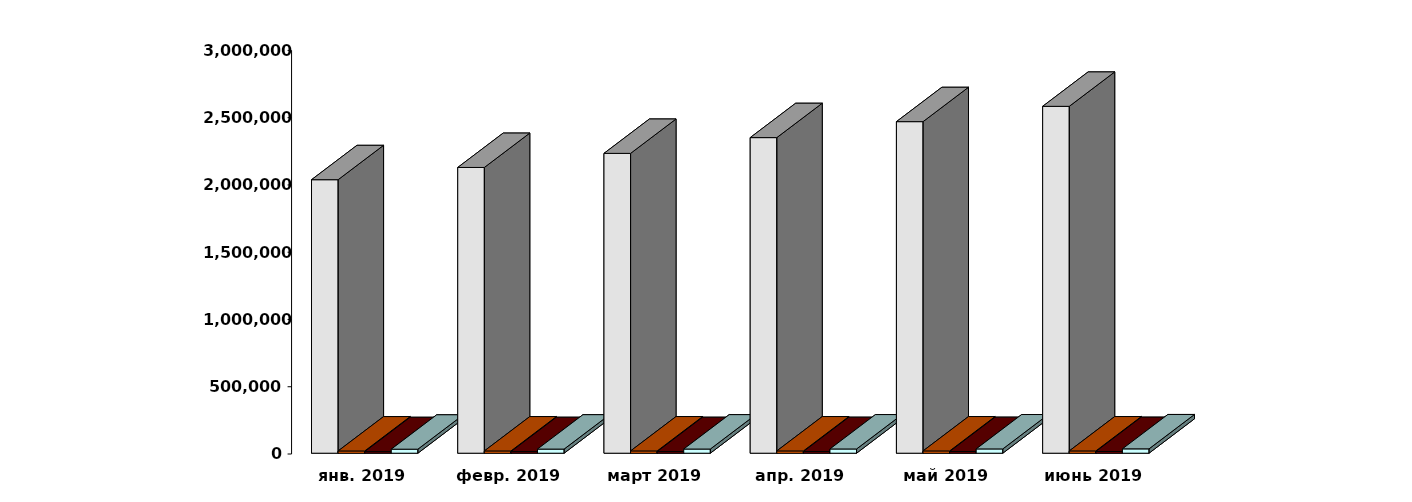
| Category | Физические лица | Юридические лица | Иностранные лица | Клиенты, передавшие свои средства в ДУ |
|---|---|---|---|---|
| 2019-01-28 | 2032931 | 16590 | 11564 | 29851 |
| 2019-02-28 | 2124042 | 16658 | 11740 | 30559 |
| 2019-03-30 | 2228680 | 16743 | 11947 | 30898 |
| 2019-04-30 | 2345873 | 16794 | 12185 | 31398 |
| 2019-05-30 | 2464521 | 16758 | 12375 | 31803 |
| 2019-06-30 | 2578398 | 16818 | 12464 | 32273 |